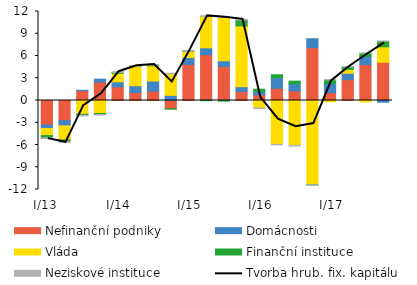
| Category | Nefinanční podniky | Domácnosti | Vláda | Finanční instituce | Neziskové instituce |
|---|---|---|---|---|---|
| I/13 | -3.311 | -0.458 | -0.959 | -0.298 | -0.115 |
| II | -2.72 | -0.704 | -1.906 | -0.213 | -0.1 |
| III | 1.327 | 0.053 | -1.854 | -0.138 | -0.085 |
|  IV | 2.469 | 0.408 | -1.759 | -0.126 | -0.085 |
|  I/14 | 1.849 | 0.665 | 1.157 | 0.113 | 0.097 |
| II | 1.069 | 0.924 | 2.592 | 0.032 | 0.075 |
| III | 1.255 | 1.369 | 2.059 | 0.071 | 0.084 |
|  IV | -1.115 | 0.689 | 2.915 | -0.051 | 0.067 |
|  I/15 | 4.865 | 0.934 | 0.823 | 0.019 | 0.116 |
| II | 6.177 | 0.926 | 4.233 | -0.024 | 0.098 |
| III | 4.588 | 0.78 | 5.852 | -0.081 | 0.102 |
| IV | 1.215 | 0.646 | 8.194 | 0.79 | 0.101 |
|  I/16 | 0.77 | 0.428 | -1.006 | 0.327 | -0.087 |
| II | 1.648 | 1.429 | -5.913 | 0.397 | -0.068 |
| III | 1.306 | 0.941 | -6.049 | 0.363 | -0.083 |
| IV | 7.122 | 1.206 | -11.328 | -0.027 | -0.082 |
|  I/17 | 1.056 | 1.242 | -0.165 | 0.483 | 0.018 |
| II | 2.811 | 0.864 | 0.53 | 0.322 | 0.023 |
| III | 4.845 | 1.093 | -0.183 | 0.434 | 0.018 |
| IV | 5.155 | -0.226 | 2.081 | 0.748 | 0.02 |